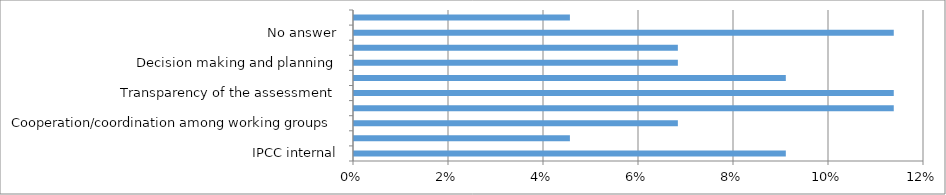
| Category | Series 0 |
|---|---|
| IPCC internal | 0.091 |
| IPCC external use | 0.045 |
| Cooperation/coordination among working groups | 0.068 |
| Curation | 0.114 |
| Transparency of the assessment | 0.114 |
| Capacity building | 0.091 |
| Decision making and planning | 0.068 |
| Ambiguous answer | 0.068 |
| No answer | 0.114 |
| NA | 0.045 |